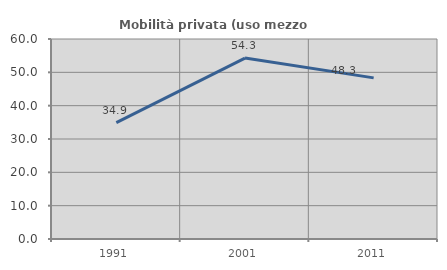
| Category | Mobilità privata (uso mezzo privato) |
|---|---|
| 1991.0 | 34.921 |
| 2001.0 | 54.286 |
| 2011.0 | 48.333 |